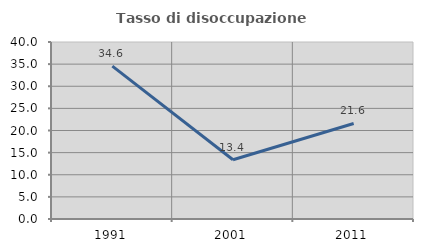
| Category | Tasso di disoccupazione giovanile  |
|---|---|
| 1991.0 | 34.559 |
| 2001.0 | 13.38 |
| 2011.0 | 21.591 |